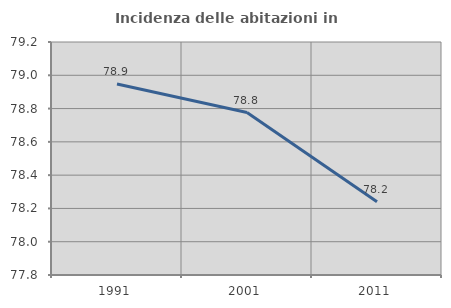
| Category | Incidenza delle abitazioni in proprietà  |
|---|---|
| 1991.0 | 78.947 |
| 2001.0 | 78.776 |
| 2011.0 | 78.24 |